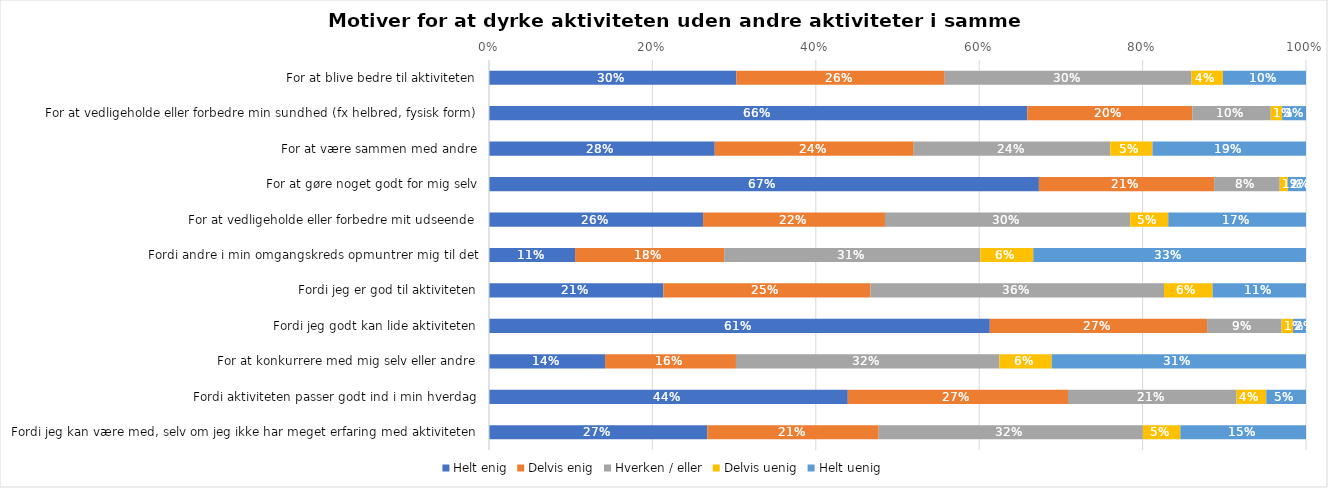
| Category | Helt enig | Delvis enig | Hverken / eller | Delvis uenig | Helt uenig |
|---|---|---|---|---|---|
| For at blive bedre til aktiviteten | 0.303 | 0.255 | 0.302 | 0.039 | 0.102 |
| For at vedligeholde eller forbedre min sundhed (fx helbred, fysisk form) | 0.659 | 0.202 | 0.096 | 0.014 | 0.029 |
| For at være sammen med andre | 0.276 | 0.244 | 0.241 | 0.052 | 0.188 |
| For at gøre noget godt for mig selv | 0.673 | 0.214 | 0.08 | 0.01 | 0.022 |
| For at vedligeholde eller forbedre mit udseende | 0.262 | 0.223 | 0.3 | 0.046 | 0.169 |
| Fordi andre i min omgangskreds opmuntrer mig til det | 0.105 | 0.183 | 0.314 | 0.065 | 0.334 |
| Fordi jeg er god til aktiviteten | 0.213 | 0.254 | 0.359 | 0.059 | 0.114 |
| Fordi jeg godt kan lide aktiviteten | 0.613 | 0.266 | 0.091 | 0.014 | 0.016 |
| For at konkurrere med mig selv eller andre | 0.142 | 0.16 | 0.322 | 0.064 | 0.311 |
| Fordi aktiviteten passer godt ind i min hverdag | 0.439 | 0.27 | 0.206 | 0.036 | 0.049 |
| Fordi jeg kan være med, selv om jeg ikke har meget erfaring med aktiviteten | 0.267 | 0.21 | 0.323 | 0.046 | 0.154 |